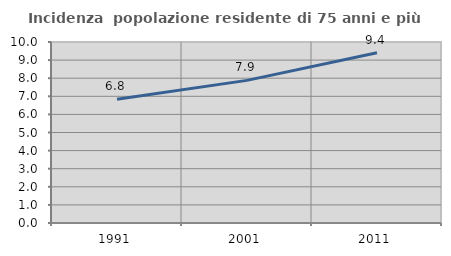
| Category | Incidenza  popolazione residente di 75 anni e più |
|---|---|
| 1991.0 | 6.841 |
| 2001.0 | 7.88 |
| 2011.0 | 9.408 |